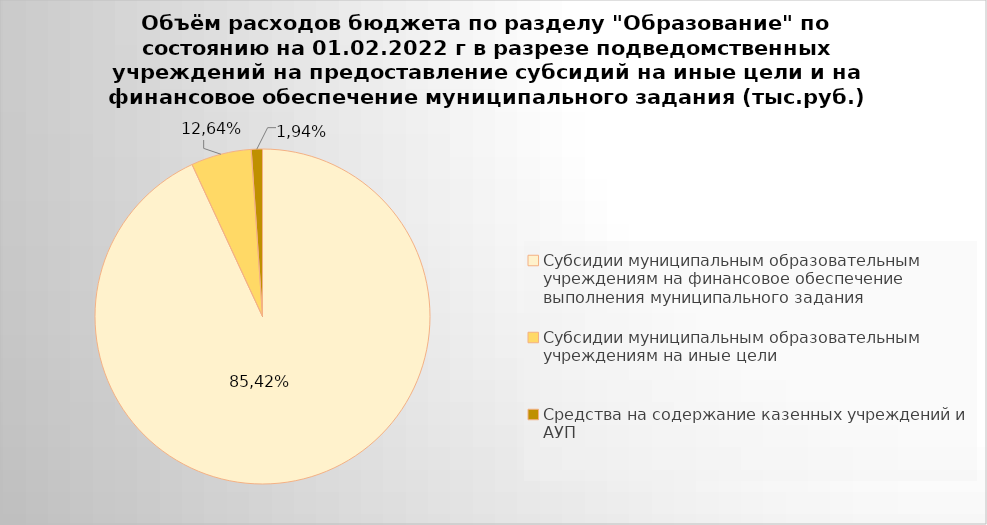
| Category | Series 0 |
|---|---|
| Субсидии муниципальным образовательным учреждениям на финансовое обеспечение выполнения муниципального задания | 6978401.63 |
| Субсидии муниципальным образовательным учреждениям на иные цели | 437534.97 |
| Средства на содержание казенных учреждений и АУП | 80487.8 |